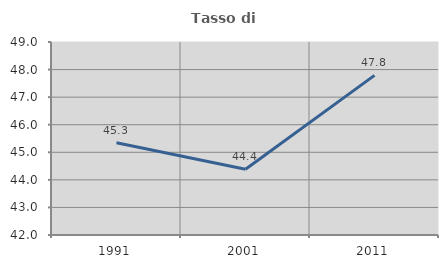
| Category | Tasso di occupazione   |
|---|---|
| 1991.0 | 45.343 |
| 2001.0 | 44.384 |
| 2011.0 | 47.79 |